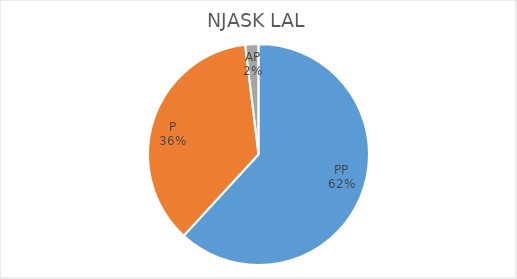
| Category | Series 0 |
|---|---|
| PP | 128 |
| P | 75 |
| AP | 4 |